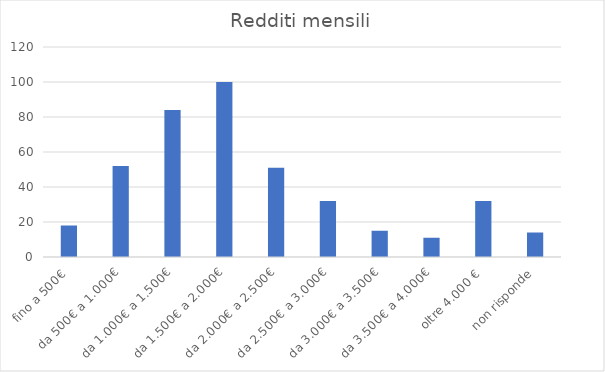
| Category | Redditi mensili |
|---|---|
| fino a 500€ | 18 |
| da 500€ a 1.000€ | 52 |
| da 1.000€ a 1.500€ | 84 |
| da 1.500€ a 2.000€ | 100 |
| da 2.000€ a 2.500€ | 51 |
| da 2.500€ a 3.000€ | 32 |
| da 3.000€ a 3.500€ | 15 |
| da 3.500€ a 4.000€ | 11 |
| oltre 4.000 € | 32 |
| non risponde | 14 |